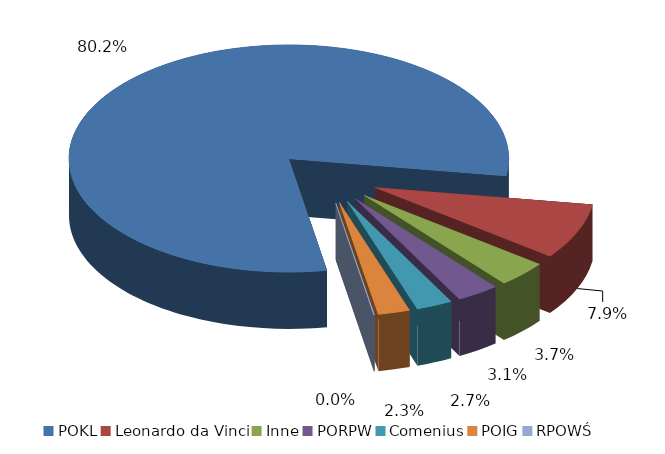
| Category | Series 0 |
|---|---|
| POKL | 10786922.86 |
| Leonardo da Vinci | 1065804.56 |
| Inne | 498114.3 |
| PORPW | 420549.58 |
| Comenius | 358315.72 |
| POIG | 313055.81 |
| RPOWŚ | 6642 |